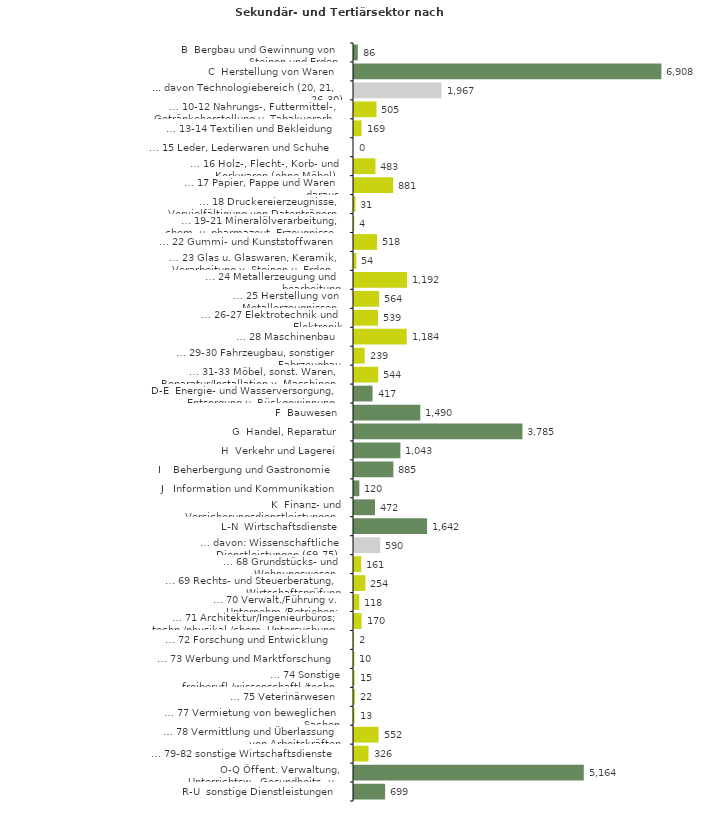
| Category | Series 0 |
|---|---|
| B  Bergbau und Gewinnung von Steinen und Erden | 86 |
| C  Herstellung von Waren | 6908 |
| ... davon Technologiebereich (20, 21, 26-30) | 1967 |
| … 10-12 Nahrungs-, Futtermittel-, Getränkeherstellung u. Tabakverarb. | 505 |
| … 13-14 Textilien und Bekleidung | 169 |
| … 15 Leder, Lederwaren und Schuhe | 0 |
| … 16 Holz-, Flecht-, Korb- und Korkwaren (ohne Möbel)  | 483 |
| … 17 Papier, Pappe und Waren daraus  | 881 |
| … 18 Druckereierzeugnisse, Vervielfältigung von Datenträgern | 31 |
| … 19-21 Mineralölverarbeitung, chem. u. pharmazeut. Erzeugnisse | 4 |
| … 22 Gummi- und Kunststoffwaren | 518 |
| … 23 Glas u. Glaswaren, Keramik, Verarbeitung v. Steinen u. Erden  | 54 |
| … 24 Metallerzeugung und -bearbeitung | 1192 |
| … 25 Herstellung von Metallerzeugnissen  | 564 |
| … 26-27 Elektrotechnik und Elektronik | 539 |
| … 28 Maschinenbau | 1184 |
| … 29-30 Fahrzeugbau, sonstiger Fahrzeugbau | 239 |
| … 31-33 Möbel, sonst. Waren, Reparatur/Installation v. Maschinen | 544 |
| D-E  Energie- und Wasserversorgung, Entsorgung u. Rückgewinnung | 417 |
| F  Bauwesen | 1490 |
| G  Handel, Reparatur | 3785 |
| H  Verkehr und Lagerei | 1043 |
| I    Beherbergung und Gastronomie | 885 |
| J   Information und Kommunikation | 120 |
| K  Finanz- und Versicherungsdienstleistungen | 472 |
| L-N  Wirtschaftsdienste | 1642 |
| … davon: Wissenschaftliche Dienstleistungen (69-75) | 590 |
| … 68 Grundstücks- und Wohnungswesen  | 161 |
| … 69 Rechts- und Steuerberatung, Wirtschaftsprüfung | 254 |
| … 70 Verwalt./Führung v. Unternehm./Betrieben; Unternehmensberat. | 118 |
| … 71 Architektur/Ingenieurbüros; techn./physikal./chem. Untersuchung | 170 |
| … 72 Forschung und Entwicklung  | 2 |
| … 73 Werbung und Marktforschung | 10 |
| … 74 Sonstige freiberufl./wissenschaftl./techn. Tätigkeiten | 15 |
| … 75 Veterinärwesen | 22 |
| … 77 Vermietung von beweglichen Sachen  | 13 |
| … 78 Vermittlung und Überlassung von Arbeitskräften | 552 |
| … 79-82 sonstige Wirtschaftsdienste | 326 |
| O-Q Öffent. Verwaltung, Unterrichtsw., Gesundheits- u. Sozialwesen | 5164 |
| R-U  sonstige Dienstleistungen | 699 |